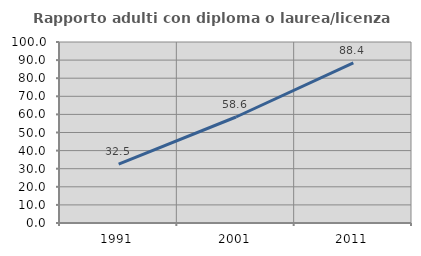
| Category | Rapporto adulti con diploma o laurea/licenza media  |
|---|---|
| 1991.0 | 32.509 |
| 2001.0 | 58.56 |
| 2011.0 | 88.414 |